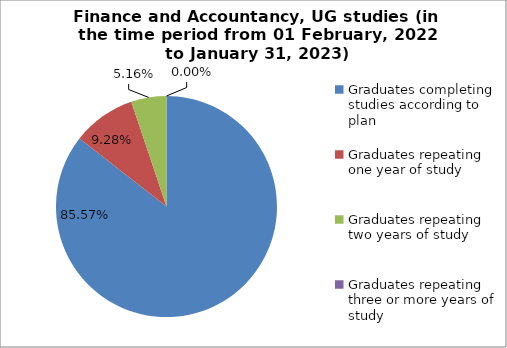
| Category | Series 0 |
|---|---|
| Graduates completing studies according to plan | 85.567 |
| Graduates repeating one year of study | 9.278 |
| Graduates repeating two years of study | 5.155 |
| Graduates repeating three or more years of study | 0 |